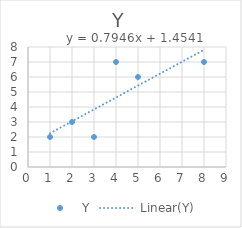
| Category | Y |
|---|---|
| 2.0 | 3 |
| 3.0 | 2 |
| 1.0 | 2 |
| 4.0 | 7 |
| 5.0 | 6 |
| 8.0 | 7 |